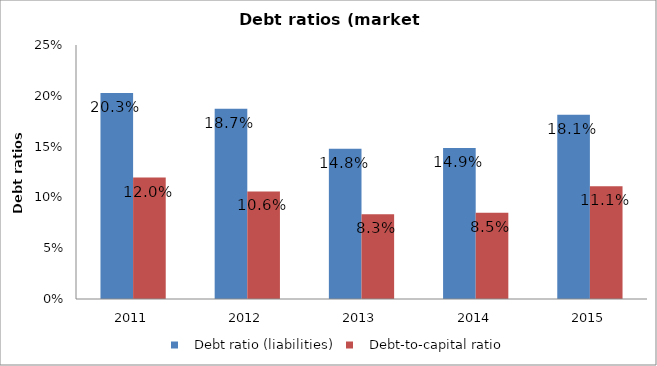
| Category |    Debt ratio (liabilities) |    Debt-to-capital ratio |
|---|---|---|
| 2011.0 | 0.203 | 0.12 |
| 2012.0 | 0.187 | 0.106 |
| 2013.0 | 0.148 | 0.083 |
| 2014.0 | 0.149 | 0.085 |
| 2015.0 | 0.181 | 0.111 |